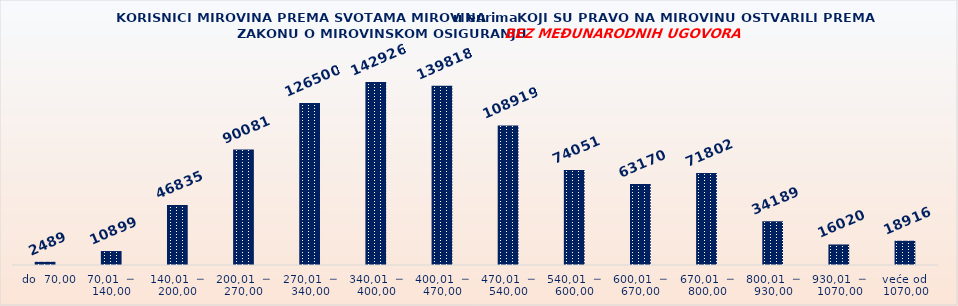
| Category | KORISNICI MIROVINA PREMA VRSTAMA I SVOTAMA MIROVINA KOJI SU PRAVO NA MIROVINU OSTVARILI PREMA ZAKONU O MIROVINSKOM OSIGURANJU 
BEZ MEĐUNARODNIH UGOVORA |
|---|---|
|   do  70,00 | 2489 |
| 70,01  ─  140,00 | 10899 |
| 140,01  ─  200,00 | 46835 |
| 200,01  ─  270,00 | 90081 |
| 270,01  ─  340,00 | 126500 |
| 340,01  ─  400,00 | 142926 |
| 400,01  ─  470,00 | 139818 |
| 470,01  ─  540,00 | 108919 |
| 540,01  ─  600,00 | 74051 |
| 600,01  ─  670,00 | 63170 |
| 670,01  ─  800,00 | 71802 |
| 800,01  ─  930,00 | 34189 |
| 930,01  ─  1070,00 | 16020 |
| veće od  1070,00 | 18916 |